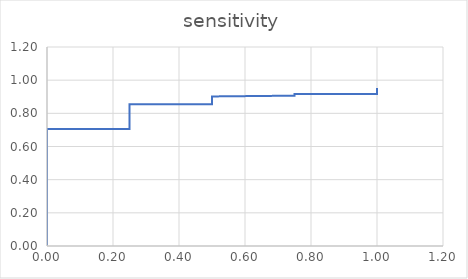
| Category | sensitivity |
|---|---|
| 0.0 | 0.005 |
| 0.0 | 0.009 |
| 0.0 | 0.014 |
| 0.0 | 0.019 |
| 0.0 | 0.023 |
| 0.0 | 0.028 |
| 0.0 | 0.033 |
| 0.0 | 0.037 |
| 0.0 | 0.042 |
| 0.0 | 0.047 |
| 0.0 | 0.051 |
| 0.0 | 0.056 |
| 0.0 | 0.061 |
| 0.0 | 0.065 |
| 0.0 | 0.07 |
| 0.0 | 0.075 |
| 0.0 | 0.079 |
| 0.0 | 0.084 |
| 0.0 | 0.089 |
| 0.0 | 0.093 |
| 0.0 | 0.098 |
| 0.0 | 0.103 |
| 0.0 | 0.107 |
| 0.0 | 0.112 |
| 0.0 | 0.117 |
| 0.0 | 0.121 |
| 0.0 | 0.126 |
| 0.0 | 0.131 |
| 0.0 | 0.136 |
| 0.0 | 0.14 |
| 0.0 | 0.145 |
| 0.0 | 0.15 |
| 0.0 | 0.154 |
| 0.0 | 0.159 |
| 0.0 | 0.164 |
| 0.0 | 0.168 |
| 0.0 | 0.173 |
| 0.0 | 0.178 |
| 0.0 | 0.182 |
| 0.0 | 0.187 |
| 0.0 | 0.192 |
| 0.0 | 0.196 |
| 0.0 | 0.201 |
| 0.0 | 0.206 |
| 0.0 | 0.21 |
| 0.0 | 0.215 |
| 0.0 | 0.22 |
| 0.0 | 0.224 |
| 0.0 | 0.229 |
| 0.0 | 0.234 |
| 0.0 | 0.238 |
| 0.0 | 0.243 |
| 0.0 | 0.248 |
| 0.0 | 0.252 |
| 0.0 | 0.257 |
| 0.0 | 0.262 |
| 0.0 | 0.266 |
| 0.0 | 0.271 |
| 0.0 | 0.276 |
| 0.0 | 0.28 |
| 0.0 | 0.285 |
| 0.0 | 0.29 |
| 0.0 | 0.294 |
| 0.0 | 0.299 |
| 0.0 | 0.304 |
| 0.0 | 0.308 |
| 0.0 | 0.313 |
| 0.0 | 0.318 |
| 0.0 | 0.322 |
| 0.0 | 0.327 |
| 0.0 | 0.332 |
| 0.0 | 0.336 |
| 0.0 | 0.341 |
| 0.0 | 0.346 |
| 0.0 | 0.35 |
| 0.0 | 0.355 |
| 0.0 | 0.36 |
| 0.0 | 0.364 |
| 0.0 | 0.369 |
| 0.0 | 0.374 |
| 0.0 | 0.379 |
| 0.0 | 0.383 |
| 0.0 | 0.388 |
| 0.0 | 0.393 |
| 0.0 | 0.397 |
| 0.0 | 0.402 |
| 0.0 | 0.407 |
| 0.0 | 0.411 |
| 0.0 | 0.416 |
| 0.0 | 0.421 |
| 0.0 | 0.425 |
| 0.0 | 0.43 |
| 0.0 | 0.435 |
| 0.0 | 0.439 |
| 0.0 | 0.444 |
| 0.0 | 0.449 |
| 0.0 | 0.453 |
| 0.0 | 0.458 |
| 0.0 | 0.463 |
| 0.0 | 0.467 |
| 0.0 | 0.472 |
| 0.0 | 0.477 |
| 0.0 | 0.481 |
| 0.0 | 0.486 |
| 0.0 | 0.491 |
| 0.0 | 0.495 |
| 0.0 | 0.5 |
| 0.0 | 0.505 |
| 0.0 | 0.509 |
| 0.0 | 0.514 |
| 0.0 | 0.519 |
| 0.0 | 0.523 |
| 0.0 | 0.528 |
| 0.0 | 0.533 |
| 0.0 | 0.537 |
| 0.0 | 0.542 |
| 0.0 | 0.547 |
| 0.0 | 0.551 |
| 0.0 | 0.556 |
| 0.0 | 0.561 |
| 0.0 | 0.565 |
| 0.0 | 0.57 |
| 0.0 | 0.575 |
| 0.0 | 0.579 |
| 0.0 | 0.584 |
| 0.0 | 0.589 |
| 0.0 | 0.593 |
| 0.0 | 0.598 |
| 0.0 | 0.603 |
| 0.0 | 0.607 |
| 0.0 | 0.612 |
| 0.0 | 0.617 |
| 0.0 | 0.621 |
| 0.0 | 0.626 |
| 0.0 | 0.631 |
| 0.0 | 0.636 |
| 0.0 | 0.64 |
| 0.0 | 0.645 |
| 0.0 | 0.65 |
| 0.0 | 0.654 |
| 0.0 | 0.659 |
| 0.0 | 0.664 |
| 0.0 | 0.668 |
| 0.0 | 0.673 |
| 0.0 | 0.678 |
| 0.0 | 0.682 |
| 0.0 | 0.687 |
| 0.0 | 0.692 |
| 0.0 | 0.696 |
| 0.0 | 0.701 |
| 0.0 | 0.706 |
| 0.25 | 0.706 |
| 0.25 | 0.71 |
| 0.25 | 0.715 |
| 0.25 | 0.72 |
| 0.25 | 0.724 |
| 0.25 | 0.729 |
| 0.25 | 0.734 |
| 0.25 | 0.738 |
| 0.25 | 0.743 |
| 0.25 | 0.748 |
| 0.25 | 0.752 |
| 0.25 | 0.757 |
| 0.25 | 0.762 |
| 0.25 | 0.766 |
| 0.25 | 0.771 |
| 0.25 | 0.776 |
| 0.25 | 0.78 |
| 0.25 | 0.785 |
| 0.25 | 0.79 |
| 0.25 | 0.794 |
| 0.25 | 0.799 |
| 0.25 | 0.804 |
| 0.25 | 0.808 |
| 0.25 | 0.813 |
| 0.25 | 0.818 |
| 0.25 | 0.822 |
| 0.25 | 0.827 |
| 0.25 | 0.832 |
| 0.25 | 0.836 |
| 0.25 | 0.841 |
| 0.25 | 0.846 |
| 0.25 | 0.85 |
| 0.25 | 0.855 |
| 0.5 | 0.855 |
| 0.5 | 0.86 |
| 0.5 | 0.864 |
| 0.5 | 0.869 |
| 0.5 | 0.874 |
| 0.5 | 0.879 |
| 0.5 | 0.883 |
| 0.5 | 0.888 |
| 0.5 | 0.893 |
| 0.5 | 0.897 |
| 0.5 | 0.902 |
| 0.5 | 0.907 |
| 0.75 | 0.907 |
| 0.75 | 0.911 |
| 0.75 | 0.916 |
| 1.0 | 0.916 |
| 1.0 | 0.921 |
| 1.0 | 0.925 |
| 1.0 | 0.93 |
| 1.0 | 0.935 |
| 1.0 | 0.939 |
| 1.0 | 0.944 |
| 1.0 | 0.949 |
| 1.0 | 0.953 |
| 1.0 | 0.958 |